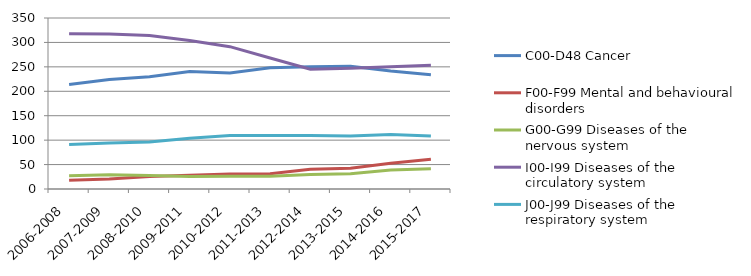
| Category | C00-D48 | F00-F99 | G00-G99 | I00-I99 | J00-J99 |
|---|---|---|---|---|---|
| 2006-2008 | 214 | 18 | 27 | 317.667 | 91 |
| 2007-2009 | 224 | 20.667 | 29 | 317 | 94.333 |
| 2008-2010 | 229.667 | 25.333 | 27.667 | 314.333 | 96 |
| 2009-2011 | 240.333 | 28 | 25.667 | 304 | 104 |
| 2010-2012 | 237.333 | 30.667 | 26 | 291.333 | 109.667 |
| 2011-2013 | 248.333 | 31.333 | 26.333 | 268 | 109.667 |
| 2012-2014 | 250.333 | 40.333 | 29.667 | 245.333 | 109.667 |
| 2013-2015 | 251.333 | 42.667 | 31.333 | 247 | 108.667 |
| 2014-2016 | 241.333 | 52.667 | 39 | 250 | 111.667 |
| 2015-2017 | 233.667 | 61 | 41.667 | 253.333 | 108.333 |